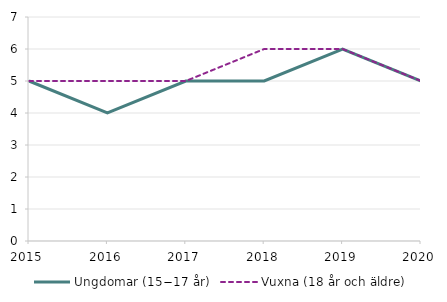
| Category | Ungdomar (15−17 år)  | Vuxna (18 år och äldre)  |
|---|---|---|
| 2015 | 5 | 5 |
| 2016 | 4 | 5 |
| 2017 | 5 | 5 |
| 2018 | 5 | 6 |
| 2019 | 6 | 6 |
| 2020 | 5 | 5 |